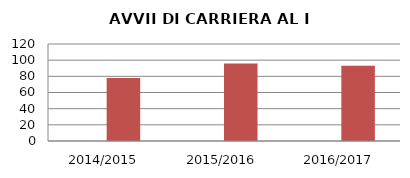
| Category | ANNO | NUMERO |
|---|---|---|
| 2014/2015 | 0 | 78 |
| 2015/2016 | 0 | 96 |
| 2016/2017 | 0 | 93 |